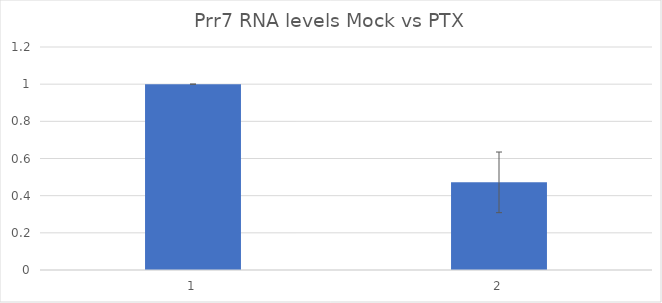
| Category | Series 0 |
|---|---|
| 0 | 1 |
| 1 | 0.472 |